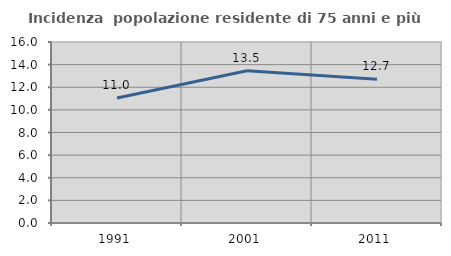
| Category | Incidenza  popolazione residente di 75 anni e più |
|---|---|
| 1991.0 | 11.042 |
| 2001.0 | 13.457 |
| 2011.0 | 12.706 |